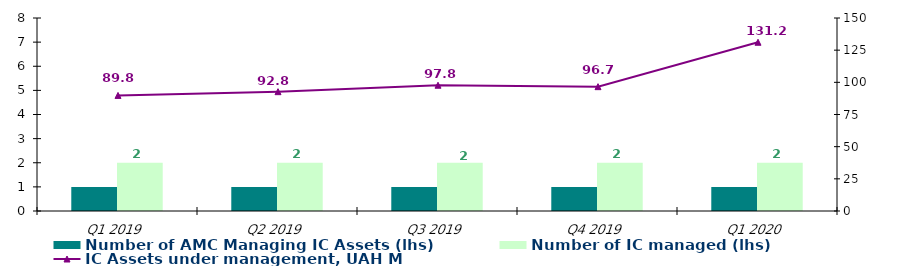
| Category | Number of AMC Managing IC Assets (lhs) | Number of IC managed (lhs) |
|---|---|---|
| Q1 2019 | 1 | 2 |
| Q2 2019 | 1 | 2 |
| Q3 2019 | 1 | 2 |
| Q4 2019 | 1 | 2 |
| Q1 2020 | 1 | 2 |